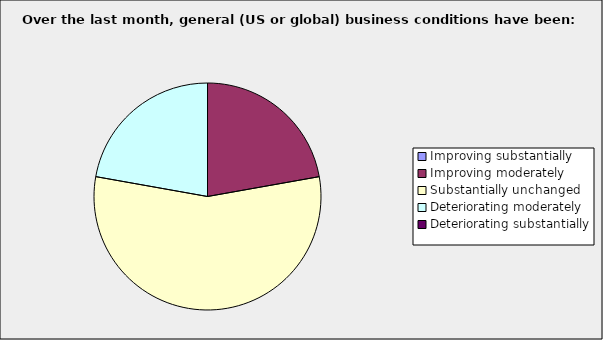
| Category | Series 0 |
|---|---|
| Improving substantially | 0 |
| Improving moderately | 0.222 |
| Substantially unchanged | 0.556 |
| Deteriorating moderately | 0.222 |
| Deteriorating substantially | 0 |